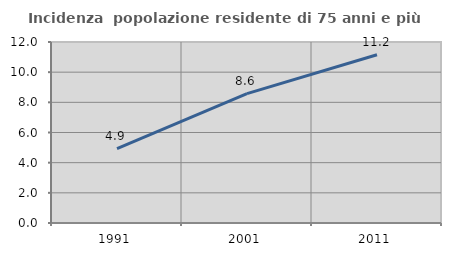
| Category | Incidenza  popolazione residente di 75 anni e più |
|---|---|
| 1991.0 | 4.938 |
| 2001.0 | 8.581 |
| 2011.0 | 11.151 |